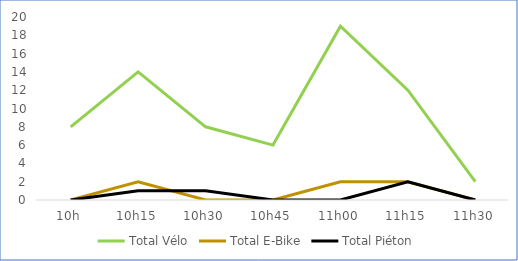
| Category | Total Vélo | Total E-Bike | Total Piéton |
|---|---|---|---|
| 10h | 8 | 0 | 0 |
| 10h15 | 14 | 2 | 1 |
| 10h30 | 8 | 0 | 1 |
| 10h45 | 6 | 0 | 0 |
| 11h00 | 19 | 2 | 0 |
| 11h15 | 12 | 2 | 2 |
| 11h30 | 2 | 0 | 0 |